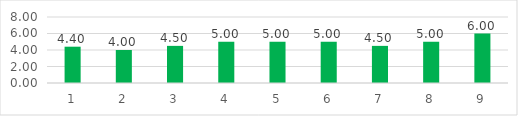
| Category | Series 0 |
|---|---|
| 0 | 4.4 |
| 1 | 4 |
| 2 | 4.5 |
| 3 | 5 |
| 4 | 5 |
| 5 | 5 |
| 6 | 4.5 |
| 7 | 5 |
| 8 | 6 |